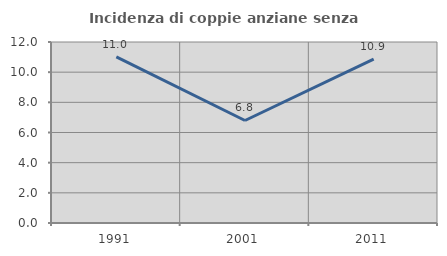
| Category | Incidenza di coppie anziane senza figli  |
|---|---|
| 1991.0 | 11.009 |
| 2001.0 | 6.796 |
| 2011.0 | 10.87 |